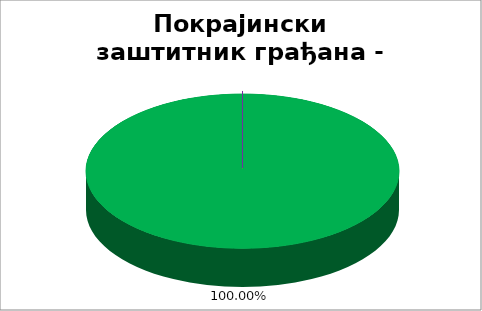
| Category | Покрајински заштитник грађана - омбудсман |
|---|---|
| 0 | 1 |
| 1 | 0 |
| 2 | 0 |
| 3 | 0 |
| 4 | 0 |